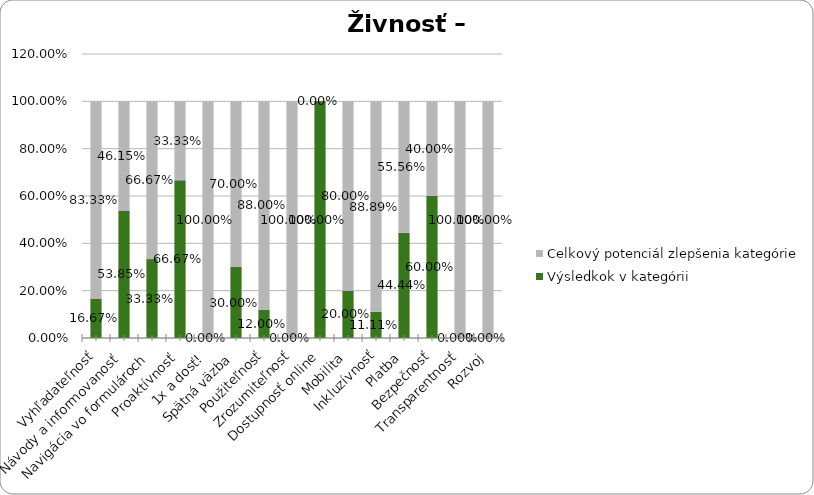
| Category | Výsledkok v kategórii | Celkový potenciál zlepšenia kategórie |
|---|---|---|
| Vyhľadateľnosť | 0.167 | 0.833 |
| Návody a informovanosť | 0.538 | 0.462 |
| Navigácia vo formulároch | 0.333 | 0.667 |
| Proaktívnosť | 0.667 | 0.333 |
| 1x a dosť! | 0 | 1 |
| Spätná väzba | 0.3 | 0.7 |
| Použiteľnosť | 0.12 | 0.88 |
| Zrozumiteľnosť | 0 | 1 |
| Dostupnosť online | 1 | 0 |
| Mobilita | 0.2 | 0.8 |
| Inkluzívnosť | 0.111 | 0.889 |
| Platba | 0.444 | 0.556 |
| Bezpečnosť | 0.6 | 0.4 |
| Transparentnosť | 0 | 1 |
| Rozvoj | 0 | 1 |